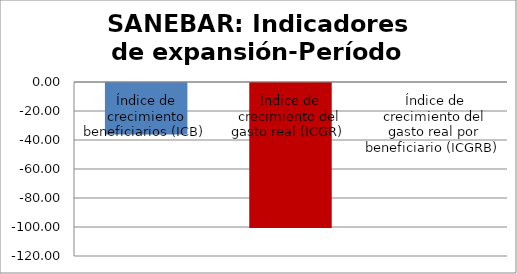
| Category | Series 0 |
|---|---|
| Índice de crecimiento beneficiarios (ICB)  | -35.572 |
| Índice de crecimiento del gasto real (ICGR)  | -100 |
| Índice de crecimiento del gasto real por beneficiario (ICGRB)  | 0 |